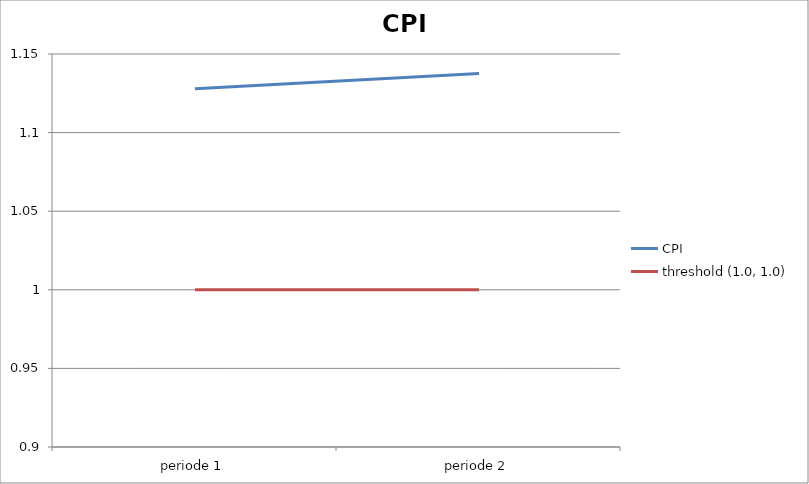
| Category | CPI | threshold (1.0, 1.0) |
|---|---|---|
| periode 1 | 1.128 | 1 |
| periode 2 | 1.138 | 1 |